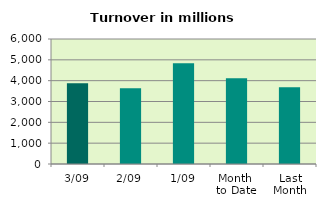
| Category | Series 0 |
|---|---|
| 3/09 | 3878.301 |
| 2/09 | 3632.122 |
| 1/09 | 4840.848 |
| Month 
to Date | 4117.09 |
| Last
Month | 3679.291 |